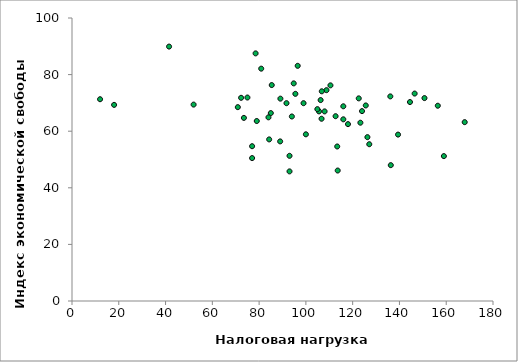
| Category | Индекс экономической свободы 2012 |
|---|---|
| 167.9 | 63.2 |
| 159.0 | 51.2 |
| 156.4 | 69 |
| 150.7 | 71.7 |
| 146.5 | 73.3 |
| 144.5 | 70.3 |
| 139.4 | 58.8 |
| 136.3 | 48 |
| 136.1 | 72.3 |
| 127.1 | 55.4 |
| 126.3 | 57.9 |
| 125.6 | 69.1 |
| 124.0 | 67.1 |
| 123.3 | 63 |
| 122.6 | 71.6 |
| 118.0 | 62.5 |
| 116.0 | 64.2 |
| 116.0 | 68.8 |
| 113.6 | 46.1 |
| 113.4 | 54.6 |
| 112.7 | 65.3 |
| 110.5 | 76.2 |
| 108.8 | 74.5 |
| 108.0 | 67 |
| 106.8 | 74.1 |
| 106.7 | 64.4 |
| 106.3 | 71 |
| 105.6 | 67 |
| 104.9 | 67.8 |
| 100.0 | 58.9 |
| 99.0 | 69.9 |
| 96.5 | 83.1 |
| 95.5 | 73.2 |
| 94.8 | 76.9 |
| 94.0 | 65.2 |
| 93.0 | 51.3 |
| 93.0 | 45.8 |
| 91.7 | 69.9 |
| 89.1 | 71.5 |
| 89.0 | 56.4 |
| 85.4 | 76.3 |
| 85.0 | 66.4 |
| 84.3 | 57.1 |
| 84.0 | 64.9 |
| 80.9 | 82.1 |
| 79.0 | 63.6 |
| 78.5 | 87.5 |
| 77.0 | 50.5 |
| 77.0 | 54.7 |
| 75.0 | 71.9 |
| 73.5 | 64.7 |
| 72.3 | 71.8 |
| 70.9 | 68.5 |
| 52.0 | 69.4 |
| 41.5 | 89.9 |
| 18.0 | 69.3 |
| 12.0 | 71.3 |